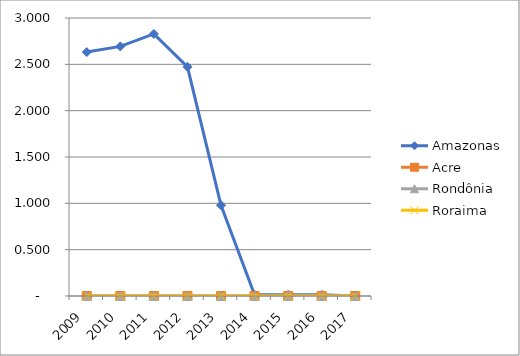
| Category | Amazonas | Acre | Rondônia | Roraima |
|---|---|---|---|---|
| 2009.0 | 2.632 | 0 | 0 | 0 |
| 2010.0 | 2.693 | 0 | 0 | 0 |
| 2011.0 | 2.828 | 0 | 0 | 0 |
| 2012.0 | 2.473 | 0 | 0 | 0 |
| 2013.0 | 0.979 | 0 | 0 | 0 |
| 2014.0 | 0.013 | 0 | 0 | 0 |
| 2015.0 | 0.012 | 0 | 0 | 0 |
| 2016.0 | 0.012 | 0 | 0 | 0 |
| 2017.0 | 0 | 0 | 0 | 0 |